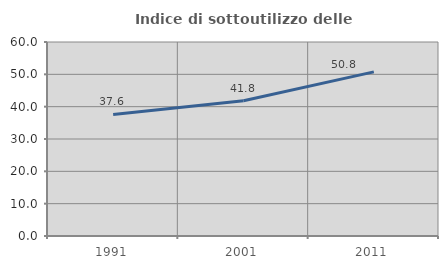
| Category | Indice di sottoutilizzo delle abitazioni  |
|---|---|
| 1991.0 | 37.598 |
| 2001.0 | 41.849 |
| 2011.0 | 50.75 |